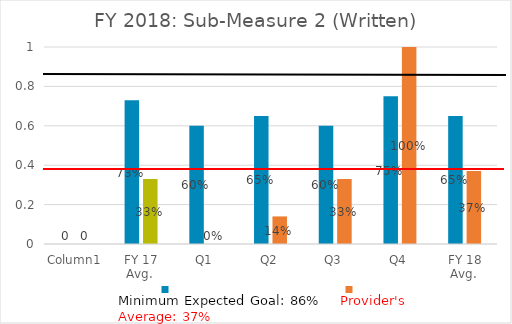
| Category | Series 0 | Series 1 |
|---|---|---|
| Column1 | 0 | 0 |
| FY 17 Avg.  | 0.73 | 0.33 |
| Q1 | 0.6 | 0 |
| Q2 | 0.65 | 0.14 |
| Q3 | 0.6 | 0.33 |
| Q4 | 0.75 | 1 |
| FY 18 Avg.  | 0.65 | 0.37 |